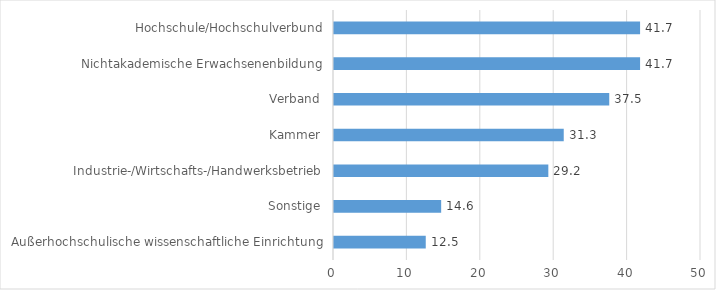
| Category | Series 0 |
|---|---|
| Außerhochschulische wissenschaftliche Einrichtung | 12.5 |
| Sonstige | 14.6 |
| Industrie-/Wirtschafts-/Handwerksbetrieb | 29.2 |
| Kammer | 31.3 |
| Verband | 37.5 |
| Nichtakademische Erwachsenenbildung | 41.7 |
| Hochschule/Hochschulverbund | 41.7 |